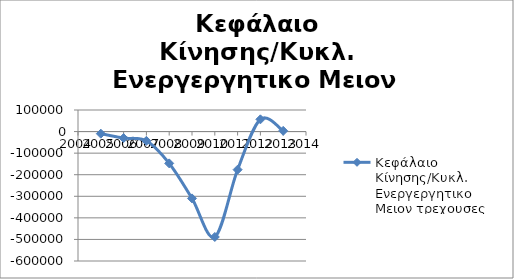
| Category | Κεφάλαιο Κίνησης/Κυκλ. Ενεργεργητικο Μειον τρεχουσες υποχρεωσεις |
|---|---|
| 2005.0 | -9686 |
| 2006.0 | -30179 |
| 2007.0 | -42937 |
| 2008.0 | -147448 |
| 2009.0 | -309764 |
| 2010.0 | -488655 |
| 2011.0 | -176591 |
| 2012.0 | 56655 |
| 2013.0 | 3368 |